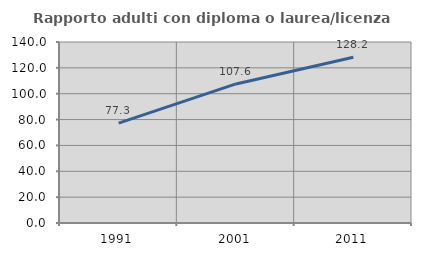
| Category | Rapporto adulti con diploma o laurea/licenza media  |
|---|---|
| 1991.0 | 77.273 |
| 2001.0 | 107.562 |
| 2011.0 | 128.154 |